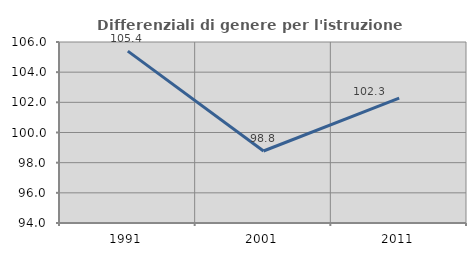
| Category | Differenziali di genere per l'istruzione superiore |
|---|---|
| 1991.0 | 105.393 |
| 2001.0 | 98.773 |
| 2011.0 | 102.282 |